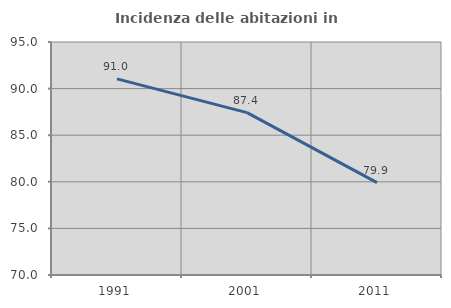
| Category | Incidenza delle abitazioni in proprietà  |
|---|---|
| 1991.0 | 91.039 |
| 2001.0 | 87.419 |
| 2011.0 | 79.904 |